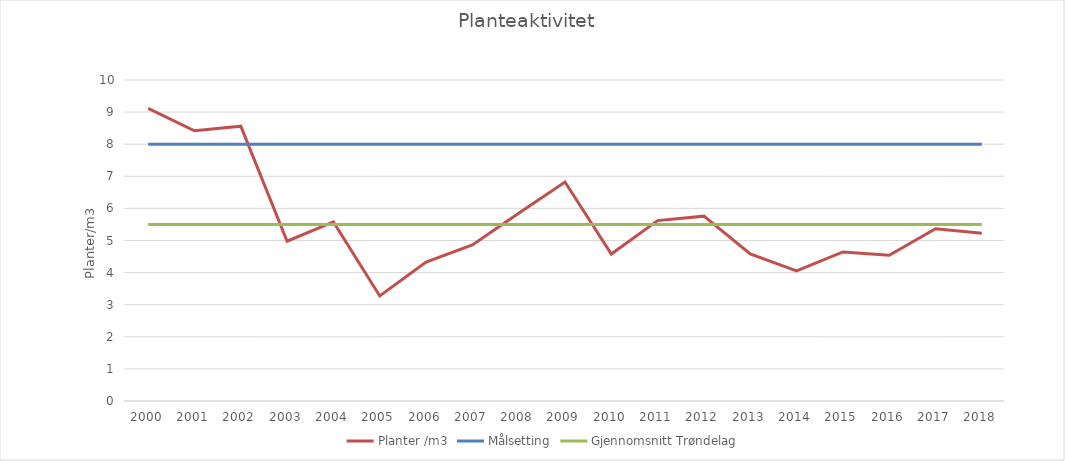
| Category | Planter /m3 | Målsetting | Gjennomsnitt Trøndelag |
|---|---|---|---|
| 2000.0 | 9.116 | 8 | 5.5 |
| 2001.0 | 8.417 | 8 | 5.5 |
| 2002.0 | 8.562 | 8 | 5.5 |
| 2003.0 | 4.978 | 8 | 5.5 |
| 2004.0 | 5.579 | 8 | 5.5 |
| 2005.0 | 3.273 | 8 | 5.5 |
| 2006.0 | 4.33 | 8 | 5.5 |
| 2007.0 | 4.86 | 8 | 5.5 |
| 2008.0 | 5.846 | 8 | 5.5 |
| 2009.0 | 6.821 | 8 | 5.5 |
| 2010.0 | 4.578 | 8 | 5.5 |
| 2011.0 | 5.62 | 8 | 5.5 |
| 2012.0 | 5.758 | 8 | 5.5 |
| 2013.0 | 4.582 | 8 | 5.5 |
| 2014.0 | 4.051 | 8 | 5.5 |
| 2015.0 | 4.643 | 8 | 5.5 |
| 2016.0 | 4.54 | 8 | 5.5 |
| 2017.0 | 5.367 | 8 | 5.5 |
| 2018.0 | 5.222 | 8 | 5.5 |